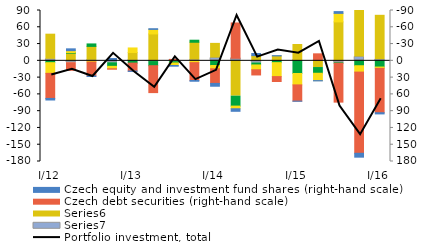
| Category | Series 6 | Series 5 | Foreign equity and investment fund shares  | Foreign debt securities   |
|---|---|---|---|---|
| I/12 | -2.798 | -44.867 | 3.306 | 19.066 |
| II | 3.249 | -13.669 | -1.1 | -3.438 |
| III | -0.915 | -24.887 | -4.429 | 2.169 |
| IV | 3.402 | -0.733 | 6.453 | 4.343 |
| I/13 | -0.714 | -14.146 | 4.078 | -8.168 |
| II | 1.279 | -48.104 | 7.436 | -8.051 |
| III | -1.224 | 1.376 | 2.417 | 4.579 |
| IV | -1.402 | -31.82 | -3.652 | 3.278 |
| I/14 | -5.024 | -26.183 | 8.294 | 5.918 |
| II | -4.546 | 63.167 | 17.782 | 4.744 |
| III | 3.872 | -9.272 | 3.481 | 8.634 |
| IV | 0.485 | -8.788 | 2.772 | 24.934 |
| I/15 | -0.202 | -29.014 | 22.663 | 20.346 |
| II | -0.554 | 11.971 | 10.252 | 13.092 |
| III | 3.2 | -69.6 | 1.008 | -15.265 |
| IV | -6.9 | -145.2 | 8.766 | 11.368 |
| I/16 | -2.1 | -79.3 | 11.129 | 2.325 |